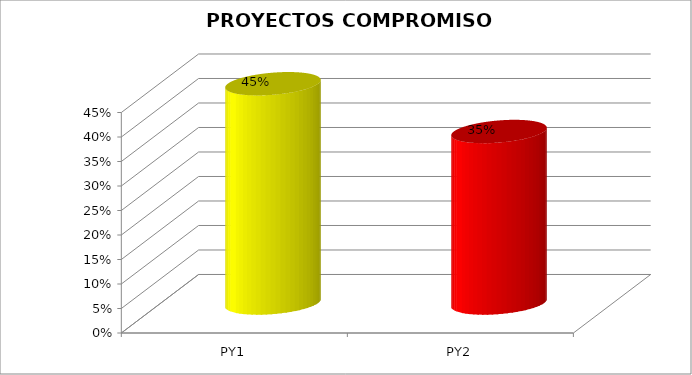
| Category | Series 0 |
|---|---|
| PY1 | 0.448 |
| PY2 | 0.35 |